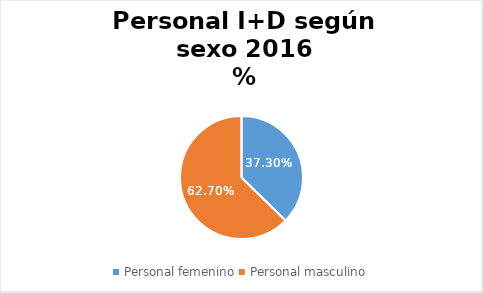
| Category | 2016 |
|---|---|
| Personal femenino | 0.373 |
| Personal masculino | 0.627 |